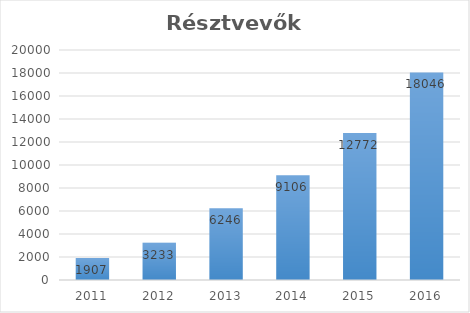
| Category | Series 0 |
|---|---|
| 2011.0 | 1907 |
| 2012.0 | 3233 |
| 2013.0 | 6246 |
| 2014.0 | 9106 |
| 2015.0 | 12772 |
| 2016.0 | 18046 |